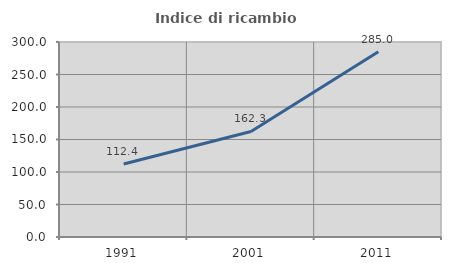
| Category | Indice di ricambio occupazionale  |
|---|---|
| 1991.0 | 112.36 |
| 2001.0 | 162.329 |
| 2011.0 | 285.034 |